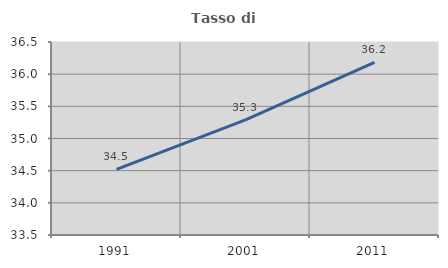
| Category | Tasso di occupazione   |
|---|---|
| 1991.0 | 34.521 |
| 2001.0 | 35.291 |
| 2011.0 | 36.185 |